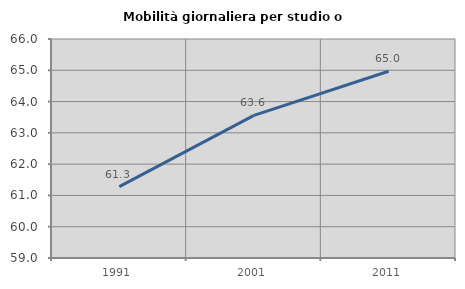
| Category | Mobilità giornaliera per studio o lavoro |
|---|---|
| 1991.0 | 61.28 |
| 2001.0 | 63.56 |
| 2011.0 | 64.969 |